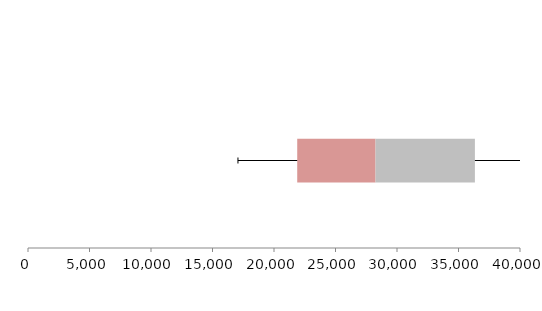
| Category | Series 1 | Series 2 | Series 3 |
|---|---|---|---|
| 0 | 21887.832 | 6367.523 | 8077.888 |